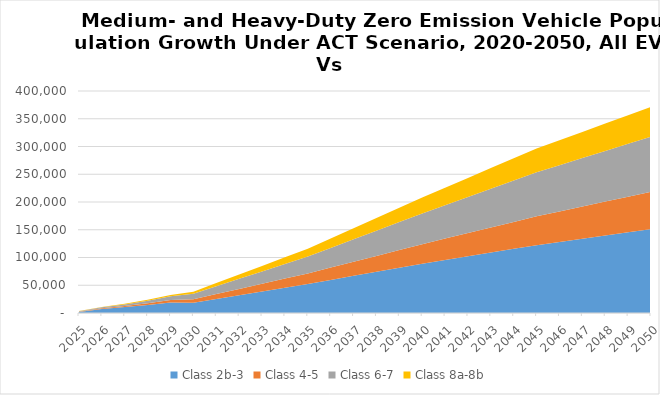
| Category | Class 2b-3 | Class 4-5 | Class 6-7 | Class 8a-8b |
|---|---|---|---|---|
| 2025.0 | 1765.146 | 552.233 | 787.98 | 304.723 |
| 2026.0 | 7411.414 | 1181.253 | 1736.462 | 658.418 |
| 2027.0 | 10671.641 | 1933.988 | 2926.89 | 1085.806 |
| 2028.0 | 14496.946 | 2946.913 | 4588.455 | 1628.83 |
| 2029.0 | 18973.582 | 4277.201 | 6847.564 | 2320.815 |
| 2030.0 | 18653.192 | 6070.038 | 9985.941 | 3769.6 |
| 2031.0 | 25398.717 | 8628.249 | 14095.368 | 5794.227 |
| 2032.0 | 32144.243 | 11186.46 | 18204.794 | 7818.855 |
| 2033.0 | 38889.768 | 13744.67 | 22314.22 | 9843.482 |
| 2034.0 | 45635.294 | 16302.881 | 26423.647 | 11868.109 |
| 2035.0 | 52380.819 | 18861.092 | 30533.073 | 13892.737 |
| 2036.0 | 59652.399 | 22136.907 | 35505.82 | 16869.245 |
| 2037.0 | 66923.978 | 25412.723 | 40478.566 | 19845.753 |
| 2038.0 | 74195.557 | 28688.538 | 45451.313 | 22822.261 |
| 2039.0 | 81467.136 | 31964.354 | 50424.059 | 25798.77 |
| 2040.0 | 88738.716 | 35240.169 | 55396.806 | 28775.278 |
| 2041.0 | 95445.574 | 38571.446 | 60192.352 | 31580.186 |
| 2042.0 | 102152.432 | 41902.722 | 64987.898 | 34385.094 |
| 2043.0 | 108859.29 | 45233.999 | 69783.444 | 37190.002 |
| 2044.0 | 115566.147 | 48565.275 | 74578.99 | 39994.91 |
| 2045.0 | 122273.005 | 51896.552 | 79374.537 | 42799.819 |
| 2046.0 | 128075.894 | 54961.851 | 83344.295 | 44959.189 |
| 2047.0 | 133878.783 | 58027.151 | 87314.053 | 47118.56 |
| 2048.0 | 139681.672 | 61092.45 | 91283.81 | 49277.93 |
| 2049.0 | 145484.561 | 64157.75 | 95253.568 | 51437.301 |
| 2050.0 | 151287.45 | 67223.049 | 99223.326 | 53596.672 |